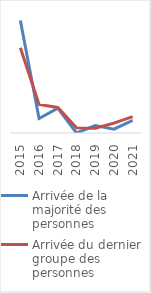
| Category | Arrivée de la majorité des personnes | Arrivée du dernier groupe des personnes |
|---|---|---|
| 2015.0 | 0.64 | 0.486 |
| 2016.0 | 0.083 | 0.162 |
| 2017.0 | 0.142 | 0.146 |
| 2018.0 | 0 | 0.03 |
| 2019.0 | 0.042 | 0.028 |
| 2020.0 | 0.022 | 0.056 |
| 2021.0 | 0.071 | 0.093 |